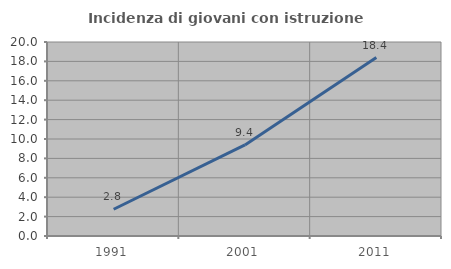
| Category | Incidenza di giovani con istruzione universitaria |
|---|---|
| 1991.0 | 2.756 |
| 2001.0 | 9.385 |
| 2011.0 | 18.391 |